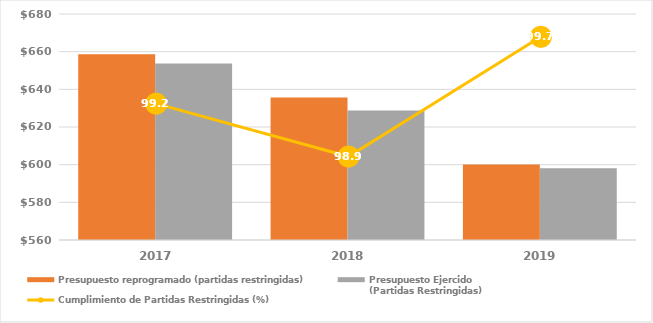
| Category | Presupuesto reprogramado (partidas restringidas) | Presupuesto Ejercido
(Partidas Restringidas) |
|---|---|---|
| 2017.0 | 658646.191 | 653670.792 |
| 2018.0 | 635684.884 | 628799.563 |
| 2019.0 | 600089.527 | 598040.902 |